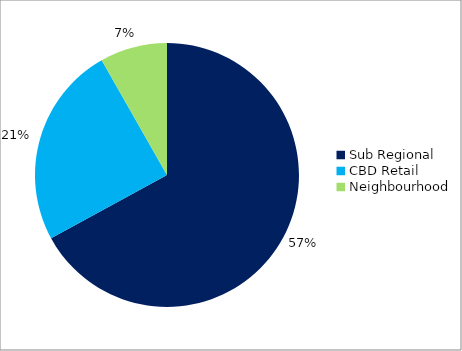
| Category | Series 0 |
|---|---|
| Sub Regional | 0.57 |
| CBD Retail | 0.21 |
| Neighbourhood | 0.07 |